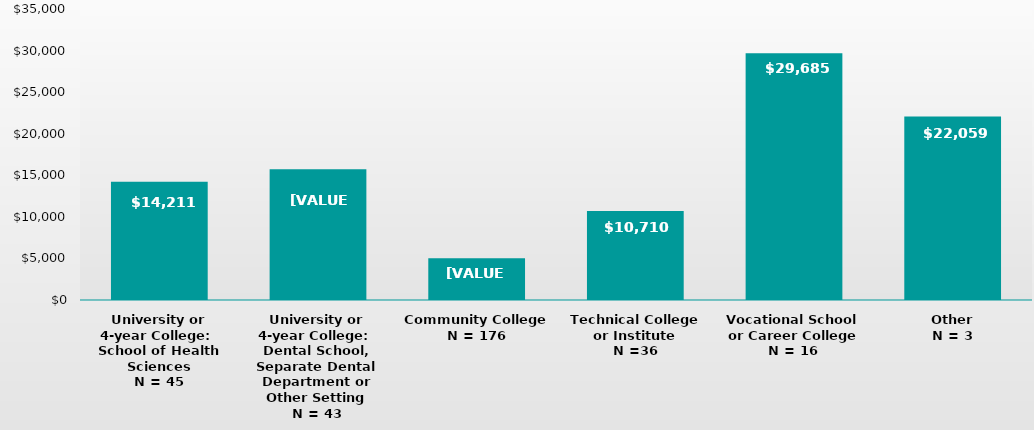
| Category | Series 0 |
|---|---|
| University or 4-year College: 
School of Health Sciences
N = 45 | 14211 |
| University or 4-year College: 
Dental School, Separate Dental Department or Other Setting
N = 43 | 15711.28 |
| Community College
N = 176 | 5036 |
| Technical College or Institute
N =36 | 10710 |
| Vocational School or Career College
N = 16 | 29685 |
| Other
N = 3 | 22059 |